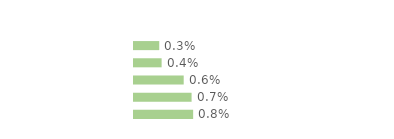
| Category | Series 0 |
|---|---|
| Communes rurales | 0.003 |
| moins de 20 000 hab. | 0.004 |
| 20 000 - 100 000 hab. | 0.006 |
| 100 000 hab. ou plus | 0.007 |
| Agglomération parisienne | 0.008 |